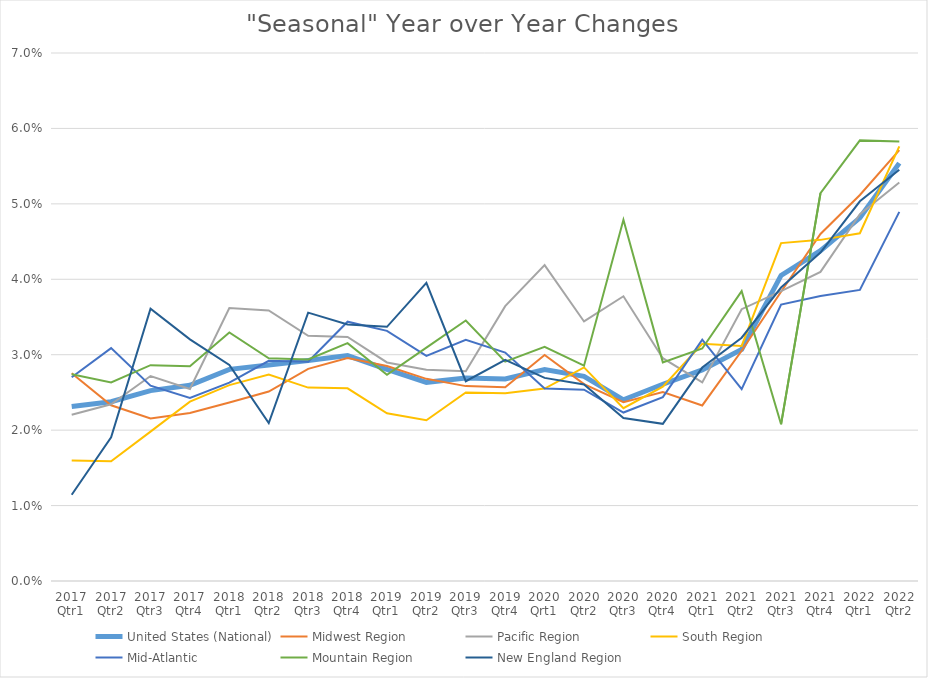
| Category | United States (National) | Midwest Region | Pacific Region | South Region | Mid-Atlantic | Mountain Region | New England Region |
|---|---|---|---|---|---|---|---|
| 2017 Qtr1 | 0.023 | 0.028 | 0.022 | 0.016 | 0.027 | 0.027 | 0.011 |
| 2017 Qtr2 | 0.024 | 0.023 | 0.023 | 0.016 | 0.031 | 0.026 | 0.019 |
| 2017 Qtr3 | 0.025 | 0.022 | 0.027 | 0.02 | 0.026 | 0.029 | 0.036 |
| 2017 Qtr4 | 0.026 | 0.022 | 0.025 | 0.024 | 0.024 | 0.028 | 0.032 |
| 2018 Qtr1 | 0.028 | 0.024 | 0.036 | 0.026 | 0.026 | 0.033 | 0.029 |
| 2018 Qtr2 | 0.029 | 0.025 | 0.036 | 0.027 | 0.029 | 0.03 | 0.021 |
| 2018 Qtr3 | 0.029 | 0.028 | 0.033 | 0.026 | 0.029 | 0.029 | 0.036 |
| 2018 Qtr4 | 0.03 | 0.03 | 0.032 | 0.026 | 0.034 | 0.032 | 0.034 |
| 2019 Qtr1 | 0.028 | 0.029 | 0.029 | 0.022 | 0.033 | 0.027 | 0.034 |
| 2019 Qtr2 | 0.026 | 0.027 | 0.028 | 0.021 | 0.03 | 0.031 | 0.04 |
| 2019 Qtr3 | 0.027 | 0.026 | 0.028 | 0.025 | 0.032 | 0.035 | 0.026 |
| 2019 Qtr4 | 0.027 | 0.026 | 0.036 | 0.025 | 0.03 | 0.029 | 0.029 |
| 2020 Qrt1 | 0.028 | 0.03 | 0.042 | 0.026 | 0.026 | 0.031 | 0.027 |
| 2020 Qtr2 | 0.027 | 0.026 | 0.034 | 0.028 | 0.025 | 0.029 | 0.026 |
| 2020 Qtr3 | 0.024 | 0.024 | 0.038 | 0.023 | 0.022 | 0.048 | 0.022 |
| 2020 Qtr4 | 0.026 | 0.025 | 0.03 | 0.026 | 0.024 | 0.029 | 0.021 |
| 2021 Qtr1 | 0.028 | 0.023 | 0.026 | 0.031 | 0.032 | 0.031 | 0.028 |
| 2021 Qtr2 | 0.031 | 0.031 | 0.036 | 0.031 | 0.025 | 0.038 | 0.032 |
| 2021 Qtr3 | 0.041 | 0.038 | 0.038 | 0.045 | 0.037 | 0.021 | 0.039 |
| 2021 Qtr4 | 0.044 | 0.046 | 0.041 | 0.045 | 0.038 | 0.051 | 0.044 |
| 2022 Qtr1 | 0.048 | 0.051 | 0.049 | 0.046 | 0.039 | 0.058 | 0.05 |
| 2022 Qtr2 | 0.055 | 0.057 | 0.053 | 0.058 | 0.049 | 0.058 | 0.055 |